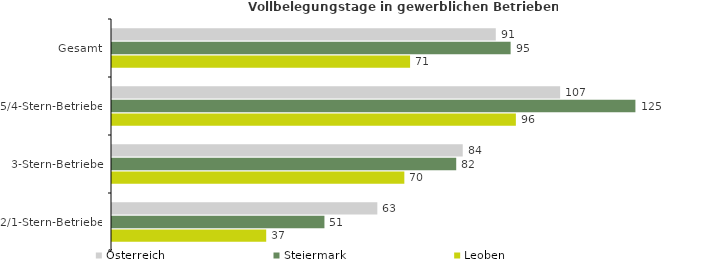
| Category | Österreich | Steiermark | Leoben |
|---|---|---|---|
| Gesamt | 91.375 | 94.907 | 70.969 |
| 5/4-Stern-Betriebe | 106.695 | 124.622 | 96.16 |
| 3-Stern-Betriebe | 83.508 | 81.957 | 69.606 |
| 2/1-Stern-Betriebe | 63.173 | 50.58 | 36.716 |